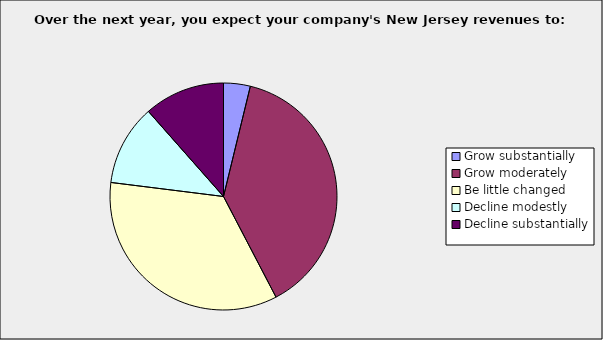
| Category | Series 0 |
|---|---|
| Grow substantially | 0.038 |
| Grow moderately | 0.385 |
| Be little changed | 0.346 |
| Decline modestly | 0.115 |
| Decline substantially | 0.115 |